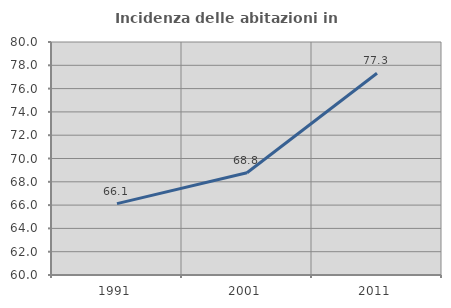
| Category | Incidenza delle abitazioni in proprietà  |
|---|---|
| 1991.0 | 66.126 |
| 2001.0 | 68.775 |
| 2011.0 | 77.318 |